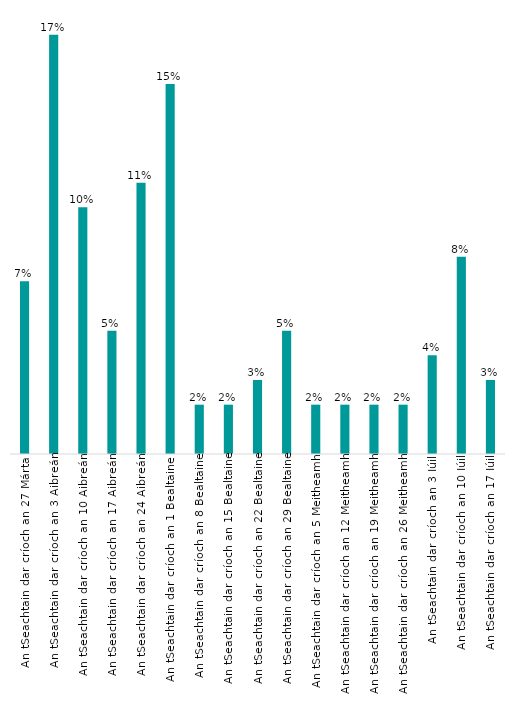
| Category | Series 0 |
|---|---|
| An tSeachtain dar críoch an 27 Márta  | 0.07 |
| An tSeachtain dar críoch an 3 Aibreán | 0.17 |
| An tSeachtain dar críoch an 10 Aibreán | 0.1 |
| An tSeachtain dar críoch an 17 Aibreán | 0.05 |
| An tSeachtain dar críoch an 24 Aibreán | 0.11 |
| An tSeachtain dar críoch an 1 Bealtaine  | 0.15 |
| An tSeachtain dar críoch an 8 Bealtaine | 0.02 |
| An tSeachtain dar críoch an 15 Bealtaine | 0.02 |
| An tSeachtain dar críoch an 22 Bealtaine | 0.03 |
| An tSeachtain dar críoch an 29 Bealtaine | 0.05 |
| An tSeachtain dar críoch an 5 Meitheamh | 0.02 |
| An tSeachtain dar críoch an 12 Meitheamh | 0.02 |
| An tSeachtain dar críoch an 19 Meitheamh | 0.02 |
| An tSeachtain dar críoch an 26 Meitheamh | 0.02 |
| An tSeachtain dar críoch an 3 Iúil | 0.04 |
| An tSeachtain dar críoch an 10 Iúil | 0.08 |
| An tSeachtain dar críoch an 17 Iúil | 0.03 |